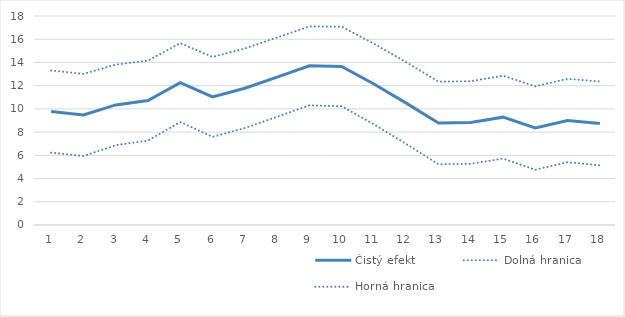
| Category | Čistý efekt | Dolná hranica | Horná hranica |
|---|---|---|---|
| 1.0 | 9.772 | 6.234 | 13.31 |
| 2.0 | 9.473 | 5.935 | 13.01 |
| 3.0 | 10.343 | 6.874 | 13.813 |
| 4.0 | 10.714 | 7.268 | 14.16 |
| 5.0 | 12.265 | 8.869 | 15.661 |
| 6.0 | 11.032 | 7.595 | 14.47 |
| 7.0 | 11.774 | 8.347 | 15.201 |
| 8.0 | 12.735 | 9.321 | 16.15 |
| 9.0 | 13.707 | 10.31 | 17.103 |
| 10.0 | 13.652 | 10.226 | 17.078 |
| 11.0 | 12.143 | 8.669 | 15.617 |
| 12.0 | 10.5 | 6.981 | 14.019 |
| 13.0 | 8.789 | 5.227 | 12.35 |
| 14.0 | 8.827 | 5.271 | 12.382 |
| 15.0 | 9.288 | 5.718 | 12.858 |
| 16.0 | 8.351 | 4.757 | 11.944 |
| 17.0 | 9 | 5.412 | 12.588 |
| 18.0 | 8.749 | 5.137 | 12.362 |